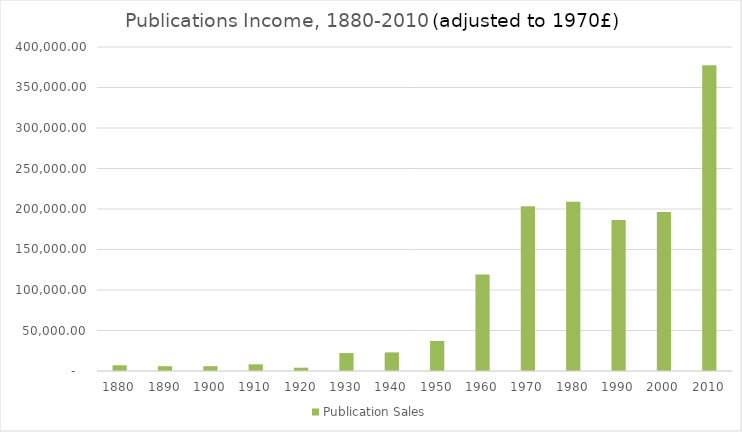
| Category | Publication Sales |
|---|---|
| 1880.0 | 7090.384 |
| 1890.0 | 5919.392 |
| 1900.0 | 5944.424 |
| 1910.0 | 8286.778 |
| 1920.0 | 4057.819 |
| 1930.0 | 22130.668 |
| 1940.0 | 22978.559 |
| 1950.0 | 37128.012 |
| 1960.0 | 119058.829 |
| 1970.0 | 203362 |
| 1980.0 | 209014.944 |
| 1990.0 | 186304.859 |
| 2000.0 | 196339.724 |
| 2010.0 | 377604.897 |